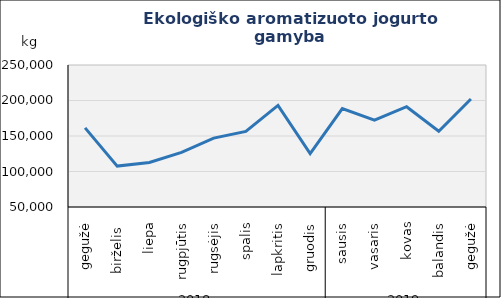
| Category | Aromatizuotas jogurtas |
|---|---|
| 0 | 161407 |
| 1 | 107590 |
| 2 | 112625 |
| 3 | 126970 |
| 4 | 146980 |
| 5 | 156460 |
| 6 | 193043 |
| 7 | 125298 |
| 8 | 188627 |
| 9 | 172396 |
| 10 | 191286 |
| 11 | 156641 |
| 12 | 202177 |